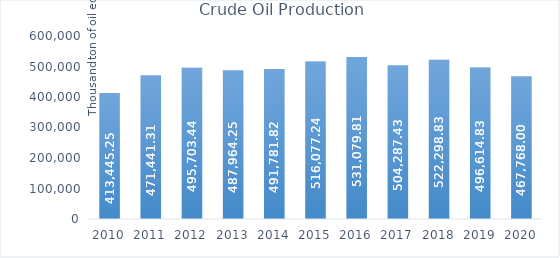
| Category | Crude Oil Production* |
|---|---|
| 2010.0 | 413445.25 |
| 2011.0 | 471441.31 |
| 2012.0 | 495703.44 |
| 2013.0 | 487964.25 |
| 2014.0 | 491781.82 |
| 2015.0 | 516077.24 |
| 2016.0 | 531079.81 |
| 2017.0 | 504287.43 |
| 2018.0 | 522298.83 |
| 2019.0 | 496614.83 |
| 2020.0 | 467768 |